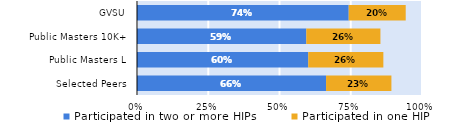
| Category | Participated in two or more HIPs | Participated in one HIP |
|---|---|---|
| Selected Peers | 0.663 | 0.229 |
| Public Masters L | 0.601 | 0.263 |
| Public Masters 10K+ | 0.594 | 0.26 |
| GVSU | 0.743 | 0.2 |